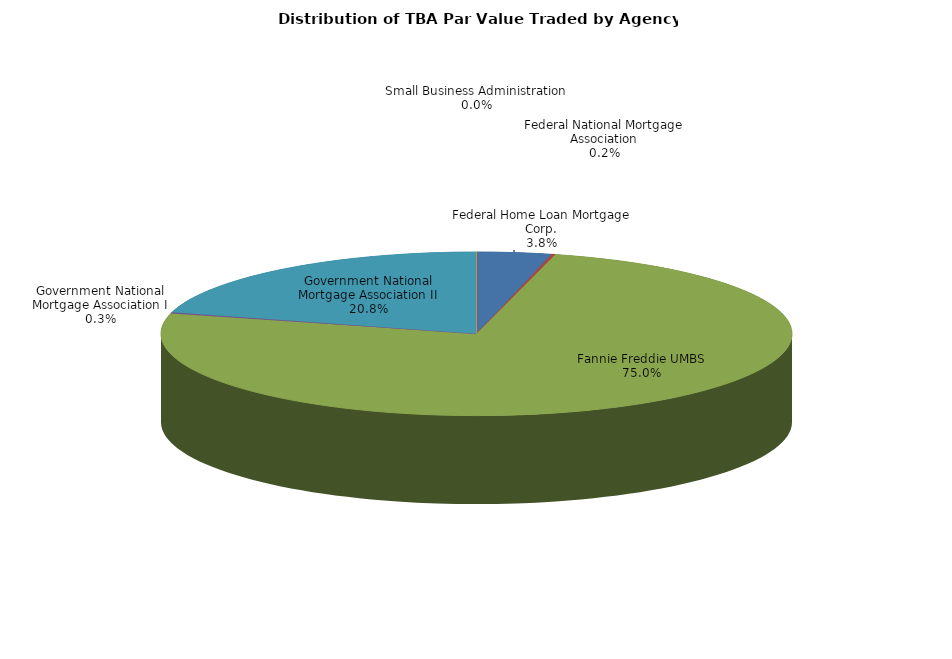
| Category | Series 0 |
|---|---|
| Federal Home Loan Mortgage Corp. | 8796661525.996 |
| Federal National Mortgage Association | 443793828.115 |
| Fannie Freddie UMBS | 172465242865.563 |
| Government National Mortgage Association I | 577651926.48 |
| Government National Mortgage Association II | 47729074401.428 |
| Small Business Administration | 0 |